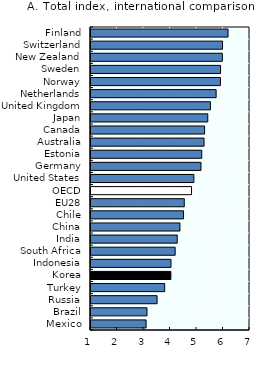
| Category | 2016-17 |
|---|---|
| Mexico | 3.079 |
| Brazil | 3.114 |
| Russia | 3.494 |
| Turkey | 3.78 |
| Korea | 4.014 |
| Indonesia | 4.019 |
| South Africa | 4.176 |
| India | 4.255 |
| China | 4.357 |
| Chile | 4.492 |
| EU28 | 4.52 |
| OECD | 4.794 |
| United States | 4.882 |
| Germany | 5.151 |
| Estonia | 5.179 |
| Australia | 5.266 |
| Canada | 5.286 |
| Japan | 5.407 |
| United Kingdom | 5.507 |
| Netherlands | 5.721 |
| Norway | 5.884 |
| Sweden | 5.89 |
| New Zealand | 5.956 |
| Switzerland | 5.965 |
| Finland | 6.172 |